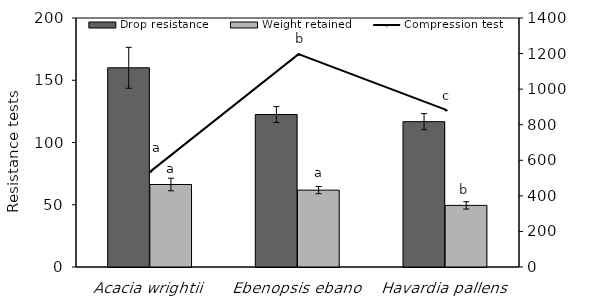
| Category | Drop resistance | Weight retained |
|---|---|---|
| Acacia wrightii | 160 | 66.275 |
| Ebenopsis ebano | 122.5 | 61.736 |
| Havardia pallens | 116.75 | 49.489 |